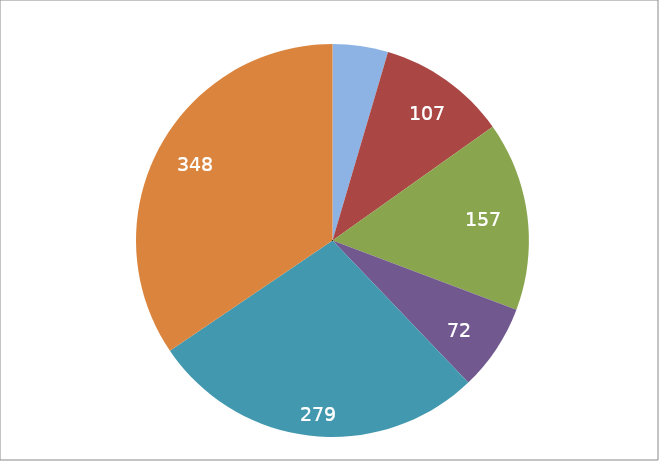
| Category | Series 1 |
|---|---|
| 0 | 46 |
| 1 | 107 |
| 2 | 157 |
| 3 | 72 |
| 4 | 279 |
| 5 | 348 |